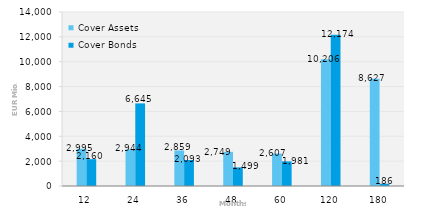
| Category | Cover Assets | Cover Bonds |
|---|---|---|
| 12.0 | 2994.615 | 2160.179 |
| 24.0 | 2943.645 | 6644.774 |
| 36.0 | 2859.453 | 2092.58 |
| 48.0 | 2749.126 | 1498.526 |
| 60.0 | 2607.379 | 1981.465 |
| 120.0 | 10206.481 | 12174.425 |
| 180.0 | 8626.585 | 186.382 |